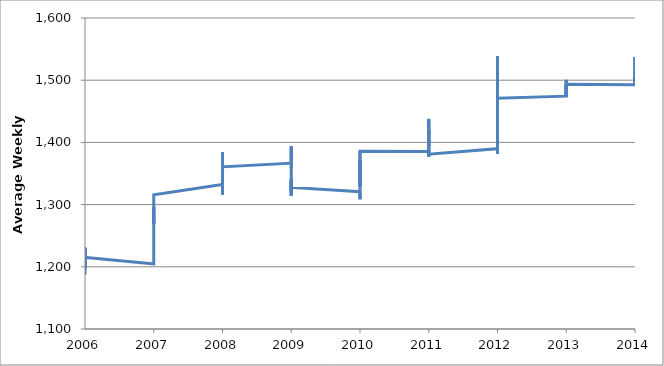
| Category | Weekly Earnings (of Utility Employees) |
|---|---|
| 2006-03-01 | 1187.28 |
| 2006-04-01 | 1214.16 |
| 2006-05-01 | 1197.24 |
| 2006-06-01 | 1207.61 |
| 2006-07-01 | 1226.41 |
| 2006-08-01 | 1204.75 |
| 2006-10-01 | 1230.57 |
| 2006-11-01 | 1220.14 |
| 2006-12-01 | 1215.14 |
| 2007-01-01 | 1204.64 |
| 2007-02-01 | 1229.73 |
| 2007-03-01 | 1235.94 |
| 2007-04-01 | 1260.59 |
| 2007-05-01 | 1262.45 |
| 2007-06-01 | 1269.66 |
| 2007-07-01 | 1272.39 |
| 2007-08-01 | 1280.26 |
| 2007-09-01 | 1295.65 |
| 2007-10-01 | 1268.91 |
| 2007-11-01 | 1274.48 |
| 2007-12-01 | 1315.63 |
| 2008-01-01 | 1332.21 |
| 2008-02-01 | 1360.53 |
| 2008-03-01 | 1354.02 |
| 2008-04-01 | 1315.86 |
| 2008-05-01 | 1343.41 |
| 2008-06-01 | 1384.36 |
| 2008-07-01 | 1340.11 |
| 2008-08-01 | 1355.33 |
| 2008-09-01 | 1361.84 |
| 2008-10-01 | 1348.34 |
| 2008-11-01 | 1360.74 |
| 2008-12-01 | 1360.79 |
| 2009-01-01 | 1366.56 |
| 2009-02-01 | 1394.01 |
| 2009-03-01 | 1357.94 |
| 2009-04-01 | 1344.38 |
| 2009-05-01 | 1332.86 |
| 2009-06-01 | 1322.29 |
| 2009-07-01 | 1338.65 |
| 2009-08-01 | 1341.93 |
| 2009-09-01 | 1314.62 |
| 2009-10-01 | 1329.24 |
| 2009-11-01 | 1337.02 |
| 2009-12-01 | 1327.62 |
| 2010-01-01 | 1320.71 |
| 2010-02-01 | 1313.82 |
| 2010-03-01 | 1308.56 |
| 2010-04-01 | 1317.39 |
| 2010-05-01 | 1356.29 |
| 2010-06-01 | 1328.35 |
| 2010-07-01 | 1344.36 |
| 2010-08-01 | 1352.54 |
| 2010-09-01 | 1350.1 |
| 2010-10-01 | 1371.04 |
| 2010-11-01 | 1343.02 |
| 2010-12-01 | 1385.58 |
| 2011-01-01 | 1385.25 |
| 2011-02-01 | 1376.96 |
| 2011-03-01 | 1404.9 |
| 2011-04-01 | 1420.02 |
| 2011-05-01 | 1414.13 |
| 2011-06-01 | 1416.97 |
| 2011-07-01 | 1395.23 |
| 2011-08-01 | 1397.31 |
| 2011-09-01 | 1437.78 |
| 2011-10-01 | 1436.94 |
| 2011-11-01 | 1406.96 |
| 2011-12-01 | 1380.96 |
| 2012-01-01 | 1389.8 |
| 2012-02-01 | 1381.44 |
| 2012-03-01 | 1393.46 |
| 2012-04-01 | 1423.76 |
| 2012-05-01 | 1410.66 |
| 2012-06-01 | 1418.56 |
| 2012-07-01 | 1460.87 |
| 2012-08-01 | 1436.25 |
| 2012-09-01 | 1442.1 |
| 2012-10-01 | 1430.73 |
| 2012-11-01 | 1538.24 |
| 2012-12-01 | 1471.09 |
| 2013-01-01 | 1474.34 |
| 2013-02-01 | 1490.48 |
| 2013-03-01 | 1481.03 |
| 2013-04-01 | 1473.62 |
| 2013-05-01 | 1482.91 |
| 2013-06-01 | 1493.03 |
| 2013-07-01 | 1481.34 |
| 2013-08-01 | 1485.86 |
| 2013-09-01 | 1500.54 |
| 2013-10-01 | 1474.62 |
| 2013-11-01 | 1475.46 |
| 2013-12-01 | 1493.29 |
| 2014-01-01 | 1492.87 |
| 2014-02-01 | 1514.98 |
| 2014-03-01 | 1510.29 |
| 2014-04-01 | 1492.77 |
| 2014-05-01 | 1499.96 |
| 2014-06-01 | 1494.3 |
| 2014-07-01 | 1504.5 |
| 2014-08-01 | 1506.05 |
| 2014-09-01 | 1499.79 |
| 2014-10-01 | 1520.39 |
| 2014-11-01 | 1537.2 |
| 2014-12-01 | 1516.67 |